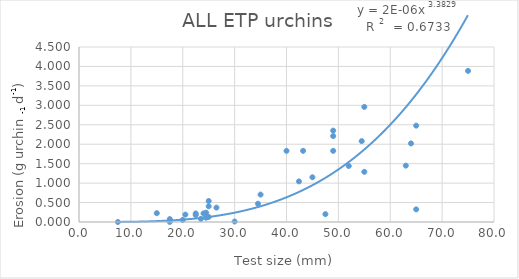
| Category | Series 0 |
|---|---|
| 20.5 | 0.19 |
| 24.5 | 0.24 |
| 22.5 | 0.18 |
| 22.5 | 0.22 |
| 24.5 | 0.11 |
| 24.0 | 0.22 |
| 23.5 | 0.08 |
| 26.5 | 0.37 |
| 34.5 | 0.47 |
| 25.0 | 0.54 |
| 40.0 | 1.83 |
| 55.0 | 2.96 |
| 15.0 | 0.227 |
| 25.0 | 0.404 |
| 35.0 | 0.705 |
| 45.0 | 1.15 |
| 55.0 | 1.29 |
| 65.0 | 2.478 |
| 75.0 | 3.886 |
| 20.0 | 0.052 |
| 47.5 | 0.202 |
| 65.0 | 0.325 |
| 7.5 | 0 |
| 17.5 | 0.002 |
| 30.0 | 0.013 |
| 42.400000000000006 | 1.044 |
| 17.5 | 0.075 |
| 25.0 | 0.13 |
| 52.0 | 1.44 |
| 54.5 | 2.08 |
| 49.0 | 1.83 |
| 49.0 | 2.21 |
| 49.0 | 2.35 |
| 43.2 | 1.83 |
| 64.0 | 2.02 |
| 63.0 | 1.45 |